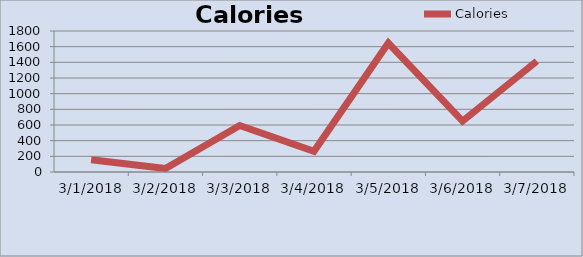
| Category | Calories  |
|---|---|
| 01/03/2018 | 156.188 |
| 02/03/2018 | 44.52 |
| 03/03/2018 | 593.6 |
| 04/03/2018 | 265.23 |
| 05/03/2018 | 1646.4 |
| 06/03/2018 | 649.688 |
| 07/03/2018 | 1415.452 |